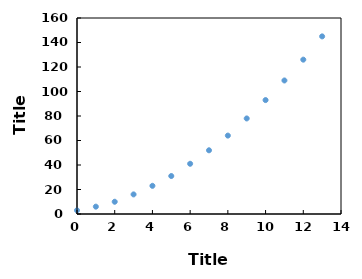
| Category | Series 0 |
|---|---|
| 0.0 | 3 |
| 1.0 | 6 |
| 2.0 | 10 |
| 3.0 | 16 |
| 4.0 | 23 |
| 5.0 | 31 |
| 6.0 | 41 |
| 7.0 | 52 |
| 8.0 | 64 |
| 9.0 | 78 |
| 10.0 | 93 |
| 11.0 | 109 |
| 12.0 | 126 |
| 13.0 | 145 |